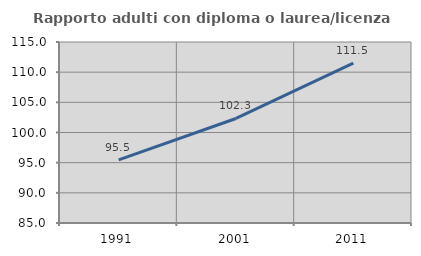
| Category | Rapporto adulti con diploma o laurea/licenza media  |
|---|---|
| 1991.0 | 95.455 |
| 2001.0 | 102.326 |
| 2011.0 | 111.494 |